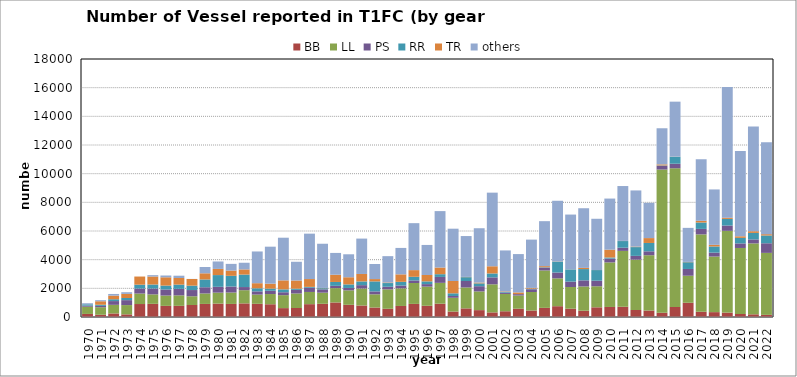
| Category | BB | LL | PS | RR | TR | others |
|---|---|---|---|---|---|---|
| 1970.0 | 214 | 503 | 79 | 91 | 0 | 74 |
| 1971.0 | 157 | 526 | 94 | 79 | 242 | 75 |
| 1972.0 | 247 | 602 | 262 | 129 | 250 | 117 |
| 1973.0 | 184 | 648 | 344 | 151 | 284 | 118 |
| 1974.0 | 905 | 731 | 350 | 269 | 568 | 0 |
| 1975.0 | 918 | 660 | 410 | 279 | 558 | 95 |
| 1976.0 | 776 | 720 | 422 | 274 | 578 | 125 |
| 1977.0 | 778 | 731 | 455 | 296 | 461 | 160 |
| 1978.0 | 838 | 608 | 435 | 306 | 465 | 5 |
| 1979.0 | 912 | 730 | 434 | 544 | 429 | 441 |
| 1980.0 | 935 | 765 | 406 | 819 | 430 | 519 |
| 1981.0 | 912 | 795 | 420 | 746 | 367 | 466 |
| 1982.0 | 950 | 920 | 220 | 870 | 361 | 464 |
| 1983.0 | 919 | 644 | 226 | 215 | 355 | 2213 |
| 1984.0 | 890 | 712 | 228 | 151 | 345 | 2580 |
| 1985.0 | 620 | 904 | 203 | 201 | 628 | 2976 |
| 1986.0 | 627 | 1014 | 252 | 83 | 571 | 1307 |
| 1987.0 | 896 | 851 | 295 | 59 | 547 | 3167 |
| 1988.0 | 921 | 776 | 233 | 81 | 16 | 3084 |
| 1989.0 | 1014 | 1001 | 160 | 269 | 505 | 1521 |
| 1990.0 | 851 | 1008 | 167 | 248 | 500 | 1602 |
| 1991.0 | 803 | 1185 | 235 | 260 | 519 | 2469 |
| 1992.0 | 661 | 921 | 205 | 698 | 161 | 1053 |
| 1993.0 | 573 | 1356 | 182 | 258 | 38 | 1838 |
| 1994.0 | 770 | 1228 | 198 | 258 | 523 | 1842 |
| 1995.0 | 914 | 1459 | 177 | 255 | 466 | 3276 |
| 1996.0 | 782 | 1337 | 176 | 192 | 444 | 2096 |
| 1997.0 | 927 | 1455 | 413 | 192 | 465 | 3936 |
| 1998.0 | 381 | 960 | 125 | 186 | 860 | 3649 |
| 1999.0 | 602 | 1459 | 452 | 266 | 18 | 2851 |
| 2000.0 | 480 | 1304 | 365 | 197 | 58 | 3789 |
| 2001.0 | 322 | 1958 | 485 | 274 | 501 | 5136 |
| 2002.0 | 401 | 1208 | 93 | 63 | 32 | 2847 |
| 2003.0 | 578 | 922 | 96 | 0 | 119 | 2675 |
| 2004.0 | 453 | 1293 | 190 | 41 | 53 | 3369 |
| 2005.0 | 637 | 2609 | 201 | 27 | 75 | 3137 |
| 2006.0 | 754 | 1942 | 407 | 764 | 13 | 4229 |
| 2007.0 | 580 | 1512 | 377 | 852 | 5 | 3821 |
| 2008.0 | 439 | 1692 | 424 | 789 | 83 | 4161 |
| 2009.0 | 676 | 1469 | 388 | 742 | 5 | 3573 |
| 2010.0 | 700 | 3109 | 264 | 78 | 546 | 3566 |
| 2011.0 | 714 | 3898 | 223 | 464 | 10 | 3828 |
| 2012.0 | 488 | 3513 | 264 | 612 | 35 | 3918 |
| 2013.0 | 451 | 3858 | 274 | 582 | 341 | 2459 |
| 2014.0 | 298 | 9991 | 260 | 26 | 74 | 2519 |
| 2015.0 | 704 | 9672 | 318 | 489 | 8 | 3833 |
| 2016.0 | 993 | 1886 | 472 | 471 | 22 | 2375 |
| 2017.0 | 366 | 5397 | 384 | 447 | 117 | 4295 |
| 2018.0 | 340 | 3877 | 274 | 430 | 114 | 3865 |
| 2019.0 | 308 | 5703 | 371 | 462 | 84 | 9119 |
| 2020.0 | 211 | 4605 | 318 | 386 | 112 | 5958 |
| 2021.0 | 187 | 4947 | 279 | 454 | 118 | 7310 |
| 2022.0 | 149 | 4324 | 672 | 543 | 93 | 6408 |